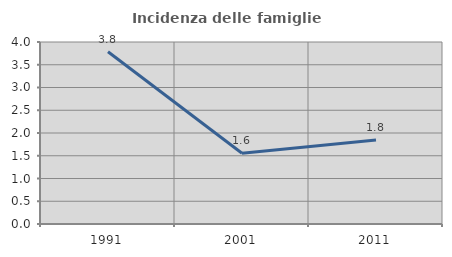
| Category | Incidenza delle famiglie numerose |
|---|---|
| 1991.0 | 3.785 |
| 2001.0 | 1.554 |
| 2011.0 | 1.845 |